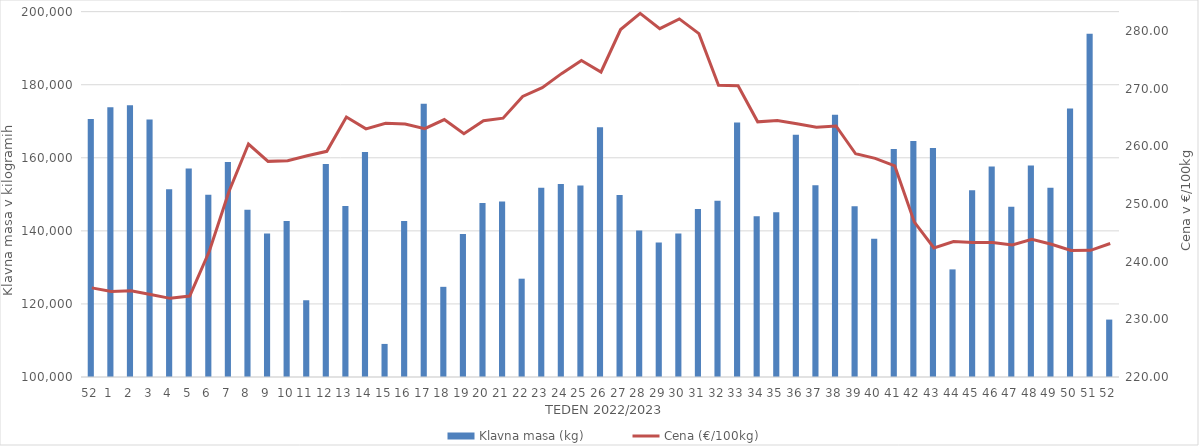
| Category | Klavna masa (kg) |
|---|---|
| 52.0 | 170609 |
| 1.0 | 173852 |
| 2.0 | 174375 |
| 3.0 | 170473 |
| 4.0 | 151417 |
| 5.0 | 157080 |
| 6.0 | 149851 |
| 7.0 | 158844 |
| 8.0 | 145794 |
| 9.0 | 139298 |
| 10.0 | 142711 |
| 11.0 | 121004 |
| 12.0 | 158331 |
| 13.0 | 146786 |
| 14.0 | 161577 |
| 15.0 | 109053 |
| 16.0 | 142733 |
| 17.0 | 174765 |
| 18.0 | 124681 |
| 19.0 | 139147 |
| 20.0 | 147655 |
| 21.0 | 148057 |
| 22.0 | 126908 |
| 23.0 | 151819 |
| 24.0 | 152857 |
| 25.0 | 152390 |
| 26.0 | 168332 |
| 27.0 | 149819 |
| 28.0 | 140094 |
| 29.0 | 136848 |
| 30.0 | 139286 |
| 31.0 | 145995 |
| 32.0 | 148245 |
| 33.0 | 169654 |
| 34.0 | 143966 |
| 35.0 | 145081 |
| 36.0 | 166280 |
| 37.0 | 152466 |
| 38.0 | 171790 |
| 39.0 | 146713 |
| 40.0 | 137840 |
| 41.0 | 162379 |
| 42.0 | 164592 |
| 43.0 | 162712 |
| 44.0 | 129452 |
| 45.0 | 151138 |
| 46.0 | 157615 |
| 47.0 | 146608 |
| 48.0 | 157916 |
| 49.0 | 151788 |
| 50.0 | 173494 |
| 51.0 | 193954 |
| 52.0 | 115717 |